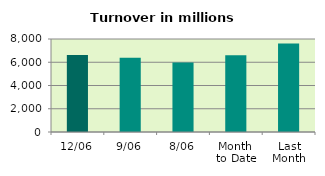
| Category | Series 0 |
|---|---|
| 12/06 | 6623.168 |
| 9/06 | 6393.485 |
| 8/06 | 5980.332 |
| Month 
to Date | 6596.854 |
| Last
Month | 7604.877 |